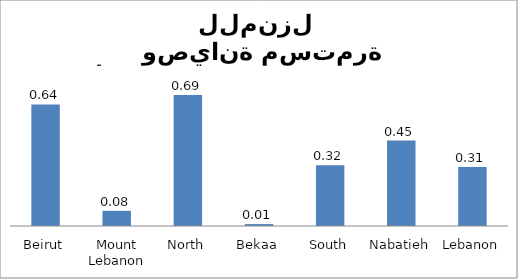
| Category | Series 0 |
|---|---|
| Beirut | 0.64 |
| Mount Lebanon | 0.08 |
| North | 0.69 |
| Bekaa | 0.01 |
| South | 0.32 |
| Nabatieh | 0.45 |
| Lebanon | 0.31 |